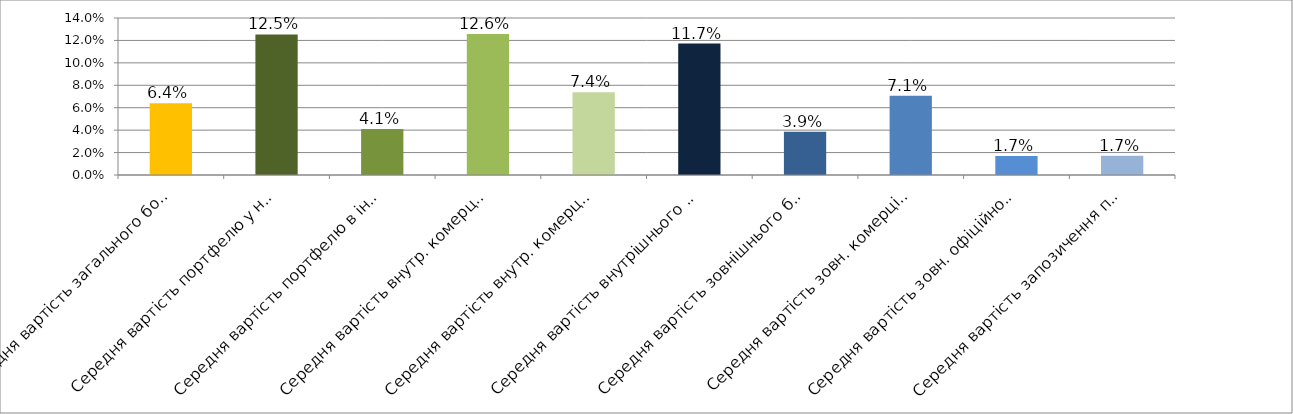
| Category | Series 0 |
|---|---|
| Середня вартість загального боргового портфелю | 0.064 |
| Середня вартість портфелю у нац.валюті | 0.125 |
| Середня вартість портфелю в іноземній валюті | 0.041 |
| Середня вартість внутр. комерційного портфелю в нац.валюті | 0.126 |
| Середня вартість внутр. комерційного портфелю в іноземній валюті | 0.074 |
| Середня вартість внутрішнього боргового портфелю | 0.117 |
| Середня вартість зовнішнього боргового портфелю | 0.039 |
| Середня вартість зовн. комерційного портфелю в іноземній валюті | 0.071 |
| Середня вартість зовн. офіційного портфелю в іноземній валюті | 0.017 |
| Середня вартість запозичення під держгарантії США в іноземній валюті | 0.017 |